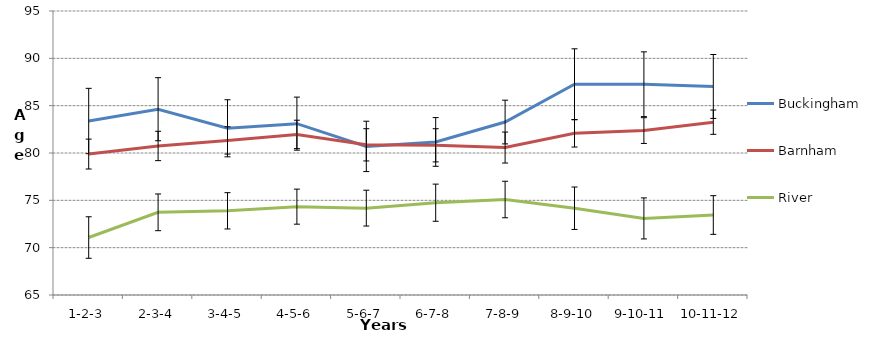
| Category | Buckingham | Barnham | River |
|---|---|---|---|
| 1-2-3 | 83.379 | 79.888 | 71.071 |
| 2-3-4 | 84.626 | 80.744 | 73.733 |
| 3-4-5 | 82.61 | 81.328 | 73.893 |
| 4-5-6 | 83.1 | 81.965 | 74.332 |
| 5-6-7 | 80.697 | 80.863 | 74.177 |
| 6-7-8 | 81.168 | 80.811 | 74.751 |
| 7-8-9 | 83.27 | 80.575 | 75.087 |
| 8-9-10 | 87.263 | 82.077 | 74.166 |
| 9-10-11 | 87.264 | 82.371 | 73.09 |
| 10-11-12 | 87.029 | 83.255 | 73.449 |